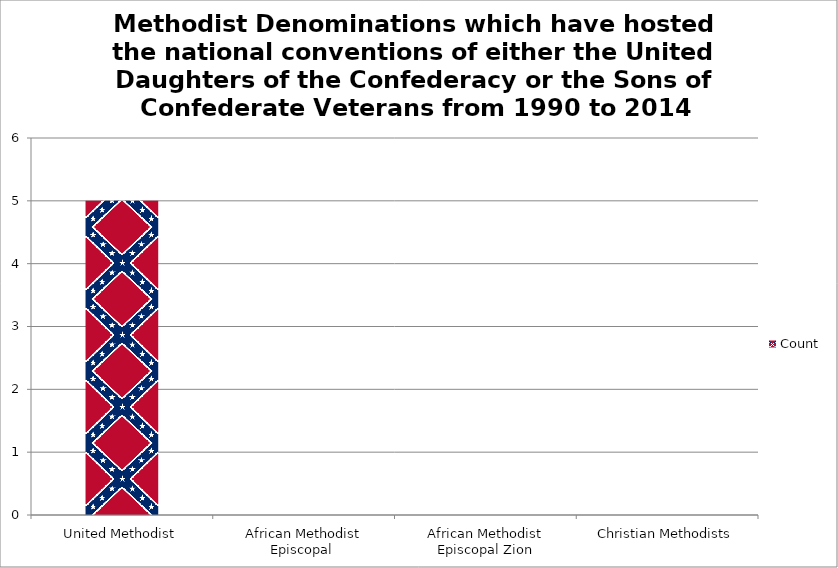
| Category | Count |
|---|---|
| United Methodist | 5 |
| African Methodist Episcopal  | 0 |
| African Methodist Episcopal Zion | 0 |
| Christian Methodists | 0 |